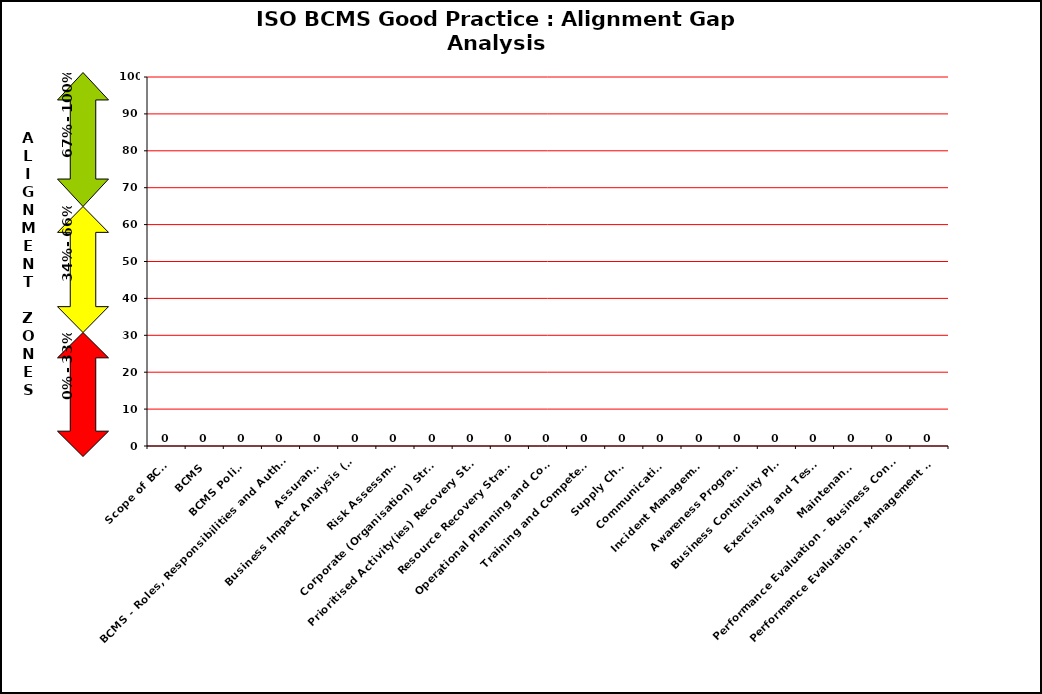
| Category | Series 0 |
|---|---|
| Scope of BCMS | 0 |
| BCMS | 0 |
| BCMS Policy | 0 |
| BCMS - Roles, Responsibilities and Authorities | 0 |
| Assurance | 0 |
| Business Impact Analysis (BIA)
Assessment | 0 |
|  Risk Assessment | 0 |
| Corporate (Organisation) Strategy | 0 |
| Prioritised Activity(ies) Recovery Strategy | 0 |
|    Resource Recovery Strategy | 0 |
| Operational Planning and Control | 0 |
| Training and Competence | 0 |
| Supply Chain | 0 |
| Communications | 0 |
| Incident Management | 0 |
| Awareness Programme | 0 |
| Business Continuity Plan(s) | 0 |
| Exercising and Testing | 0 |
| Maintenance | 0 |
| Performance Evaluation - Business Continuity Arrangements | 0 |
| Performance Evaluation - Management Review | 0 |